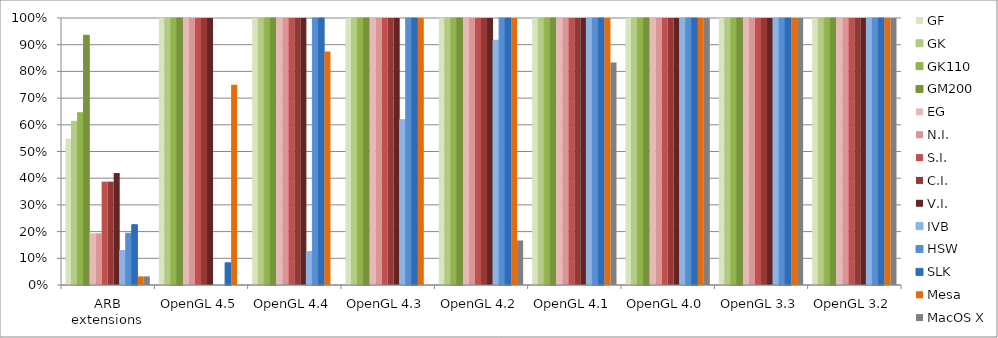
| Category | GF | GK | GK110 | GM200 | EG | N.I. | S.I. | C.I. | V.I. | IVB | HSW | SLK | Mesa | MacOS X |
|---|---|---|---|---|---|---|---|---|---|---|---|---|---|---|
| ARB extensions | 0.548 | 0.613 | 0.645 | 0.935 | 0.194 | 0.194 | 0.387 | 0.387 | 0.419 | 0.129 | 0.194 | 0.226 | 0.032 | 0.032 |
| OpenGL 4.5 | 1 | 1 | 1 | 1 | 1 | 1 | 1 | 1 | 1 | 0 | 0 | 0.083 | 0.75 | 0 |
| OpenGL 4.4 | 1 | 1 | 1 | 1 | 1 | 1 | 1 | 1 | 1 | 0.125 | 1 | 1 | 0.875 | 0 |
| OpenGL 4.3 | 1 | 1 | 1 | 1 | 1 | 1 | 1 | 1 | 1 | 0.619 | 1 | 1 | 1 | 0 |
| OpenGL 4.2 | 1 | 1 | 1 | 1 | 1 | 1 | 1 | 1 | 1 | 0.917 | 1 | 1 | 1 | 0.167 |
| OpenGL 4.1 | 1 | 1 | 1 | 1 | 1 | 1 | 1 | 1 | 1 | 1 | 1 | 1 | 1 | 0.833 |
| OpenGL 4.0 | 1 | 1 | 1 | 1 | 1 | 1 | 1 | 1 | 1 | 1 | 1 | 1 | 1 | 1 |
| OpenGL 3.3 | 1 | 1 | 1 | 1 | 1 | 1 | 1 | 1 | 1 | 1 | 1 | 1 | 1 | 1 |
| OpenGL 3.2 | 1 | 1 | 1 | 1 | 1 | 1 | 1 | 1 | 1 | 1 | 1 | 1 | 1 | 1 |